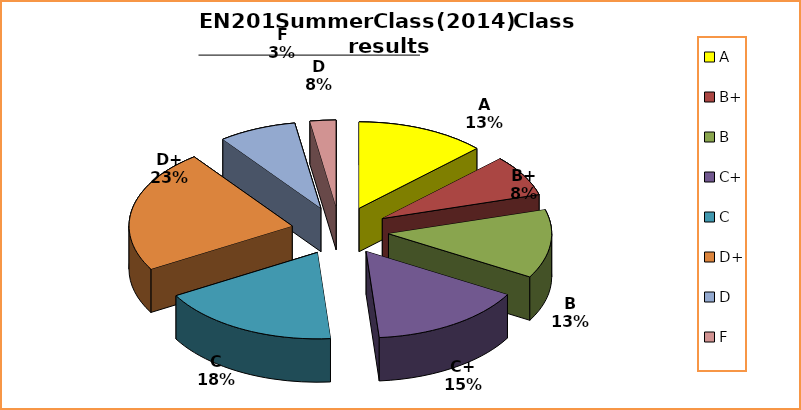
| Category | Series 0 |
|---|---|
| A | 5 |
| B+ | 3 |
| B | 5 |
| C+ | 6 |
| C | 7 |
| D+ | 9 |
| D | 3 |
| F | 1 |